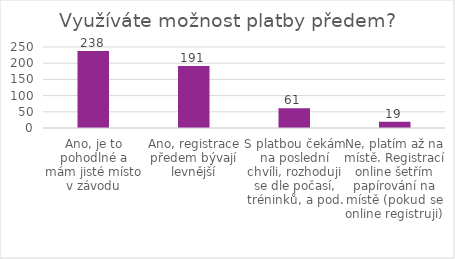
| Category | Series 0 |
|---|---|
| Ano, je to pohodlné a mám jisté místo v závodu | 238 |
| Ano, registrace předem bývají levnější | 191 |
| S platbou čekám na poslední chvíli, rozhoduji se dle počasí, tréninků, a pod. | 61 |
| Ne, platím až na místě. Registrací online šetřím papírování na místě (pokud se online registruji) | 19 |